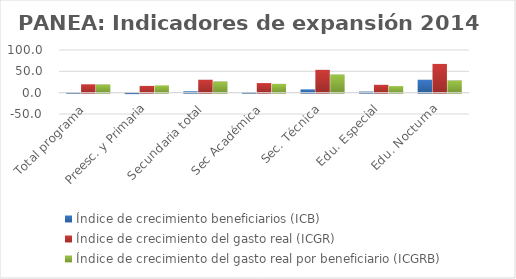
| Category | Índice de crecimiento beneficiarios (ICB)  | Índice de crecimiento del gasto real (ICGR)  | Índice de crecimiento del gasto real por beneficiario (ICGRB)  |
|---|---|---|---|
| Total programa | 0.511 | 19.634 | 19.026 |
| Preesc. y Primaria | -1.079 | 15.836 | 17.099 |
| Secundaria total | 3.295 | 30.248 | 26.093 |
| Sec Académica | 1.603 | 22.537 | 20.603 |
| Sec. Técnica | 7.748 | 53.46 | 42.424 |
| Edu. Especial | 2.508 | 18.363 | 15.467 |
| Edu. Nocturna | 30.257 | 67.37 | 28.492 |